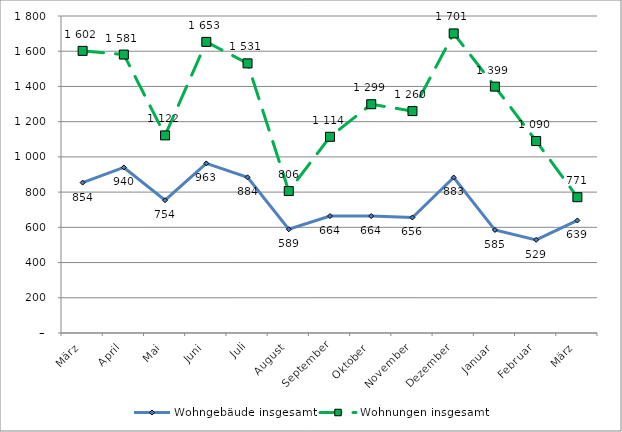
| Category | Wohngebäude insgesamt | Wohnungen insgesamt |
|---|---|---|
| März | 854 | 1602 |
| April | 940 | 1581 |
| Mai | 754 | 1122 |
| Juni | 963 | 1653 |
| Juli | 884 | 1531 |
| August | 589 | 806 |
| September | 664 | 1114 |
| Oktober | 664 | 1299 |
| November | 656 | 1260 |
| Dezember | 883 | 1701 |
| Januar | 585 | 1399 |
| Februar | 529 | 1090 |
| März | 639 | 771 |